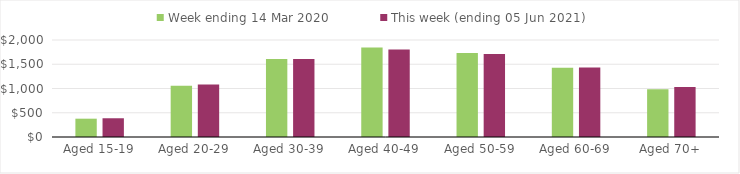
| Category | Week ending 14 Mar 2020 | This week (ending 05 Jun 2021) |
|---|---|---|
| Aged 15-19 | 377.66 | 386.43 |
| Aged 20-29 | 1055.41 | 1084.93 |
| Aged 30-39 | 1610.22 | 1606.65 |
| Aged 40-49 | 1846.65 | 1806.25 |
| Aged 50-59 | 1732.32 | 1709.42 |
| Aged 60-69 | 1428.83 | 1434.79 |
| Aged 70+ | 982.92 | 1028.83 |